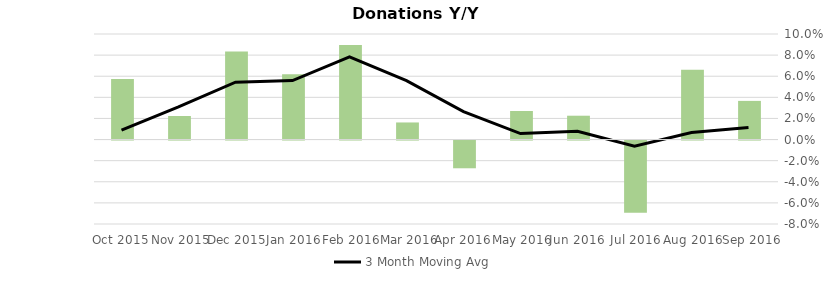
| Category | Donation Index Amount Y/Y Growth |
|---|---|
| Sep 2016 | 0.037 |
| Aug 2016 | 0.066 |
| Jul 2016 | -0.068 |
| Jun 2016 | 0.023 |
| May 2016 | 0.027 |
| Apr 2016 | -0.026 |
| Mar 2016 | 0.016 |
| Feb 2016 | 0.09 |
| Jan 2016 | 0.062 |
| Dec 2015 | 0.084 |
| Nov 2015 | 0.022 |
| Oct 2015 | 0.057 |